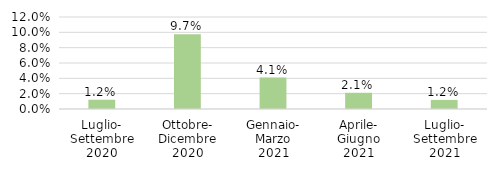
| Category | Abruzzo |
|---|---|
| Luglio-
Settembre
2020 | 0.012 |
| Ottobre-
Dicembre
2020 | 0.097 |
| Gennaio-
Marzo
2021 | 0.041 |
| Aprile-
Giugno
2021 | 0.021 |
| Luglio-
Settembre
2021 | 0.012 |